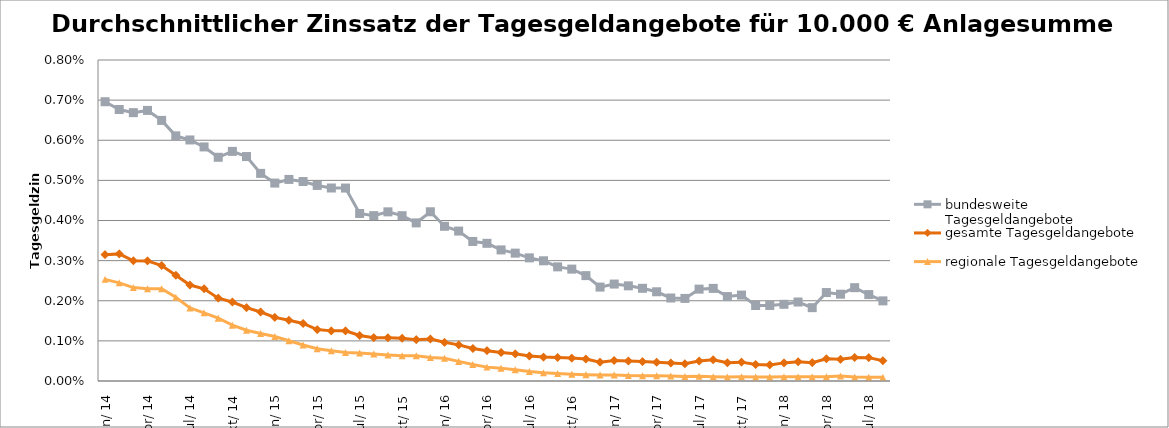
| Category | bundesweite Tagesgeldangebote | gesamte Tagesgeldangebote | regionale Tagesgeldangebote |
|---|---|---|---|
| 2014-01-01 | 0.007 | 0.003 | 0.003 |
| 2014-02-01 | 0.007 | 0.003 | 0.002 |
| 2014-03-01 | 0.007 | 0.003 | 0.002 |
| 2014-04-01 | 0.007 | 0.003 | 0.002 |
| 2014-05-01 | 0.006 | 0.003 | 0.002 |
| 2014-06-01 | 0.006 | 0.003 | 0.002 |
| 2014-07-01 | 0.006 | 0.002 | 0.002 |
| 2014-08-01 | 0.006 | 0.002 | 0.002 |
| 2014-09-01 | 0.006 | 0.002 | 0.002 |
| 2014-10-01 | 0.006 | 0.002 | 0.001 |
| 2014-11-01 | 0.006 | 0.002 | 0.001 |
| 2014-12-01 | 0.005 | 0.002 | 0.001 |
| 2015-01-01 | 0.005 | 0.002 | 0.001 |
| 2015-02-01 | 0.005 | 0.002 | 0.001 |
| 2015-03-01 | 0.005 | 0.001 | 0.001 |
| 2015-04-01 | 0.005 | 0.001 | 0.001 |
| 2015-05-01 | 0.005 | 0.001 | 0.001 |
| 2015-06-01 | 0.005 | 0.001 | 0.001 |
| 2015-07-01 | 0.004 | 0.001 | 0.001 |
| 2015-08-01 | 0.004 | 0.001 | 0.001 |
| 2015-09-01 | 0.004 | 0.001 | 0.001 |
| 2015-10-01 | 0.004 | 0.001 | 0.001 |
| 2015-11-01 | 0.004 | 0.001 | 0.001 |
| 2015-12-01 | 0.004 | 0.001 | 0.001 |
| 2016-01-01 | 0.004 | 0.001 | 0.001 |
| 2016-02-01 | 0.004 | 0.001 | 0 |
| 2016-03-01 | 0.003 | 0.001 | 0 |
| 2016-04-01 | 0.003 | 0.001 | 0 |
| 2016-05-01 | 0.003 | 0.001 | 0 |
| 2016-06-01 | 0.003 | 0.001 | 0 |
| 2016-07-01 | 0.003 | 0.001 | 0 |
| 2016-08-01 | 0.003 | 0.001 | 0 |
| 2016-09-01 | 0.003 | 0.001 | 0 |
| 2016-10-01 | 0.003 | 0.001 | 0 |
| 2016-11-01 | 0.003 | 0.001 | 0 |
| 2016-12-01 | 0.002 | 0 | 0 |
| 2017-01-01 | 0.002 | 0.001 | 0 |
| 2017-02-01 | 0.002 | 0 | 0 |
| 2017-03-01 | 0.002 | 0 | 0 |
| 2017-04-01 | 0.002 | 0 | 0 |
| 2017-05-01 | 0.002 | 0 | 0 |
| 2017-06-01 | 0.002 | 0 | 0 |
| 2017-07-01 | 0.002 | 0 | 0 |
| 2017-08-01 | 0.002 | 0.001 | 0 |
| 2017-09-01 | 0.002 | 0 | 0 |
| 2017-10-01 | 0.002 | 0 | 0 |
| 2017-11-01 | 0.002 | 0 | 0 |
| 2017-12-01 | 0.002 | 0 | 0 |
| 2018-01-01 | 0.002 | 0 | 0 |
| 2018-02-01 | 0.002 | 0 | 0 |
| 2018-03-01 | 0.002 | 0 | 0 |
| 2018-04-01 | 0.002 | 0.001 | 0 |
| 2018-05-01 | 0.002 | 0.001 | 0 |
| 2018-06-01 | 0.002 | 0.001 | 0 |
| 2018-07-01 | 0.002 | 0.001 | 0 |
| 2018-08-01 | 0.002 | 0.001 | 0 |